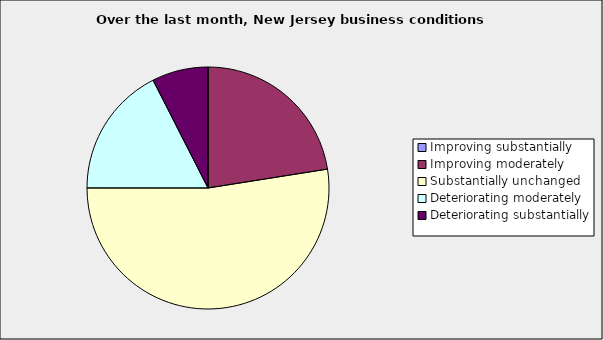
| Category | Series 0 |
|---|---|
| Improving substantially | 0 |
| Improving moderately | 0.225 |
| Substantially unchanged | 0.525 |
| Deteriorating moderately | 0.175 |
| Deteriorating substantially | 0.075 |